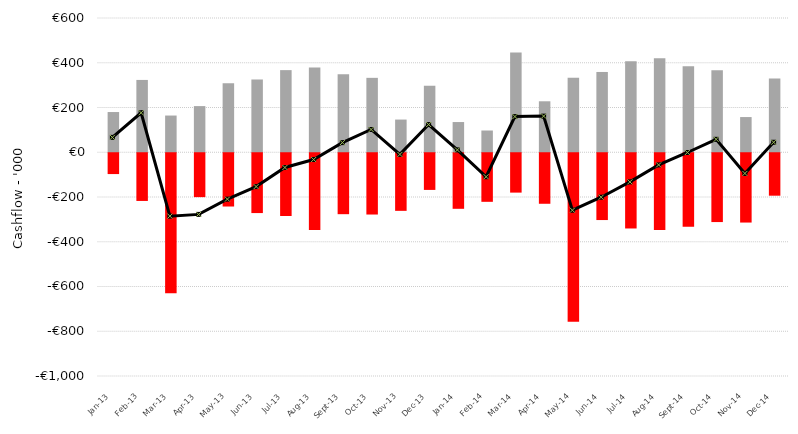
| Category | In | Out |
|---|---|---|
| 2013-01-01 | 179726.629 | -93057.533 |
| 2013-02-01 | 323171.955 | -213171.904 |
| 2013-03-01 | 164051.335 | -626024.613 |
| 2013-04-01 | 206252.308 | -196132.443 |
| 2013-05-01 | 308548.173 | -238070.87 |
| 2013-06-01 | 325232.52 | -267366.246 |
| 2013-07-01 | 367064.901 | -280461.06 |
| 2013-08-01 | 379251.375 | -343038.761 |
| 2013-09-01 | 348123.172 | -272340.992 |
| 2013-10-01 | 332559.07 | -273867.952 |
| 2013-11-01 | 146068.021 | -257432.9 |
| 2013-12-01 | 297408.616 | -163866.57 |
| 2014-01-01 | 134969.832 | -248276.095 |
| 2014-02-01 | 97159.87 | -217077.299 |
| 2014-03-01 | 445733.116 | -175930.646 |
| 2014-04-01 | 227790.129 | -225792.809 |
| 2014-05-01 | 332441.918 | -752942.253 |
| 2014-06-01 | 358813.352 | -298562.123 |
| 2014-07-01 | 406367.852 | -336218.588 |
| 2014-08-01 | 419965.549 | -342971.293 |
| 2014-09-01 | 384310.906 | -328377.43 |
| 2014-10-01 | 366483.584 | -307577.337 |
| 2014-11-01 | 157274.851 | -309738.734 |
| 2014-12-01 | 329830.263 | -189725.56 |